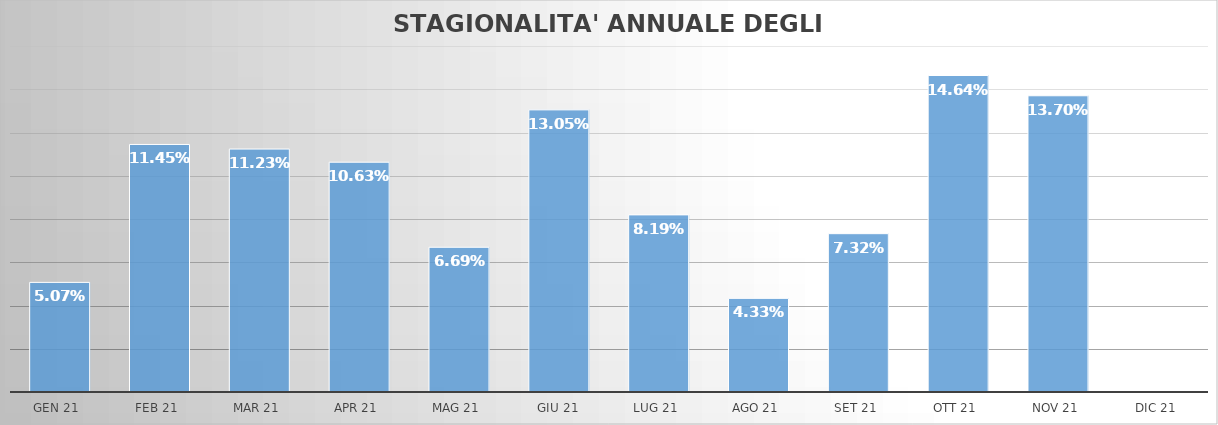
| Category | Series 0 |
|---|---|
|  GEN 21   | 0.051 |
|  FEB 21   | 0.114 |
|  MAR 21   | 0.112 |
|  APR 21   | 0.106 |
|  MAG 21   | 0.067 |
|  GIU 21  | 0.13 |
|  LUG 21   | 0.082 |
|  AGO 21   | 0.043 |
|  SET 21   | 0.073 |
|  OTT 21   | 0.146 |
|  NOV 21   | 0.137 |
|  DIC 21   | 0 |